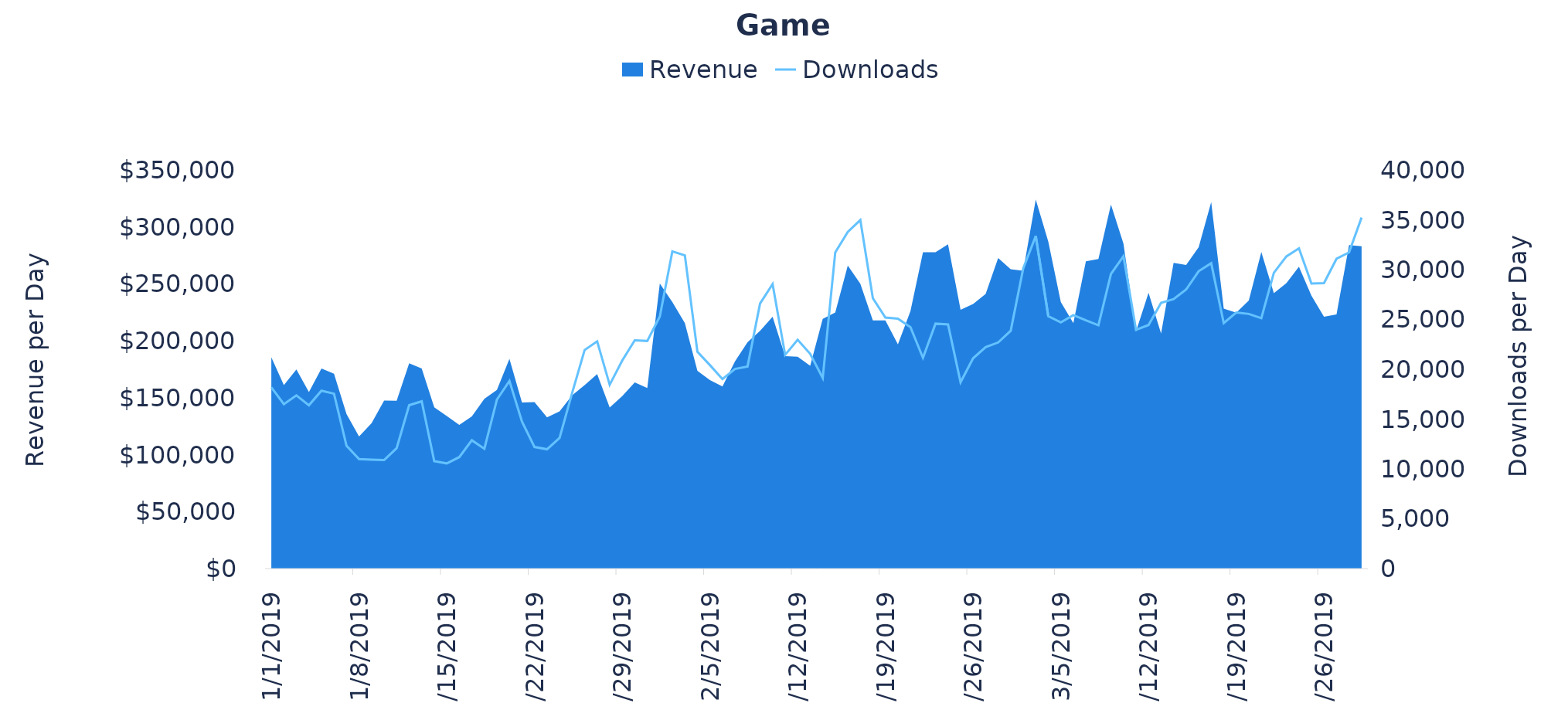
| Category | Downloads |
|---|---|
| 1/1/19 | 18193 |
| 1/2/19 | 16496 |
| 1/3/19 | 17381 |
| 1/4/19 | 16388 |
| 1/5/19 | 17849 |
| 1/6/19 | 17547 |
| 1/7/19 | 12320 |
| 1/8/19 | 10983 |
| 1/9/19 | 10930 |
| 1/10/19 | 10892 |
| 1/11/19 | 12080 |
| 1/12/19 | 16399 |
| 1/13/19 | 16783 |
| 1/14/19 | 10780 |
| 1/15/19 | 10556 |
| 1/16/19 | 11186 |
| 1/17/19 | 12875 |
| 1/18/19 | 12024 |
| 1/19/19 | 16955 |
| 1/20/19 | 18824 |
| 1/21/19 | 14754 |
| 1/22/19 | 12204 |
| 1/23/19 | 11973 |
| 1/24/19 | 13109 |
| 1/25/19 | 17600 |
| 1/26/19 | 21927 |
| 1/27/19 | 22801 |
| 1/28/19 | 18444 |
| 1/29/19 | 20877 |
| 1/30/19 | 22909 |
| 1/31/19 | 22842 |
| 2/1/19 | 25294 |
| 2/2/19 | 31829 |
| 2/3/19 | 31430 |
| 2/4/19 | 21763 |
| 2/5/19 | 20418 |
| 2/6/19 | 19015 |
| 2/7/19 | 20030 |
| 2/8/19 | 20281 |
| 2/9/19 | 26599 |
| 2/10/19 | 28549 |
| 2/11/19 | 21446 |
| 2/12/19 | 22959 |
| 2/13/19 | 21548 |
| 2/14/19 | 19124 |
| 2/15/19 | 31727 |
| 2/16/19 | 33782 |
| 2/17/19 | 34977 |
| 2/18/19 | 27131 |
| 2/19/19 | 25194 |
| 2/20/19 | 25073 |
| 2/21/19 | 24222 |
| 2/22/19 | 21147 |
| 2/23/19 | 24581 |
| 2/24/19 | 24496 |
| 2/25/19 | 18699 |
| 2/26/19 | 21103 |
| 2/27/19 | 22218 |
| 2/28/19 | 22690 |
| 3/1/19 | 23860 |
| 3/2/19 | 30113 |
| 3/3/19 | 33374 |
| 3/4/19 | 25329 |
| 3/5/19 | 24711 |
| 3/6/19 | 25435 |
| 3/7/19 | 24905 |
| 3/8/19 | 24411 |
| 3/9/19 | 29570 |
| 3/10/19 | 31343 |
| 3/11/19 | 23963 |
| 3/12/19 | 24439 |
| 3/13/19 | 26663 |
| 3/14/19 | 27040 |
| 3/15/19 | 28001 |
| 3/16/19 | 29840 |
| 3/17/19 | 30647 |
| 3/18/19 | 24637 |
| 3/19/19 | 25699 |
| 3/20/19 | 25552 |
| 3/21/19 | 25131 |
| 3/22/19 | 29682 |
| 3/23/19 | 31321 |
| 3/24/19 | 32133 |
| 3/25/19 | 28609 |
| 3/26/19 | 28648 |
| 3/27/19 | 31086 |
| 3/28/19 | 31725 |
| 3/29/19 | 35223 |